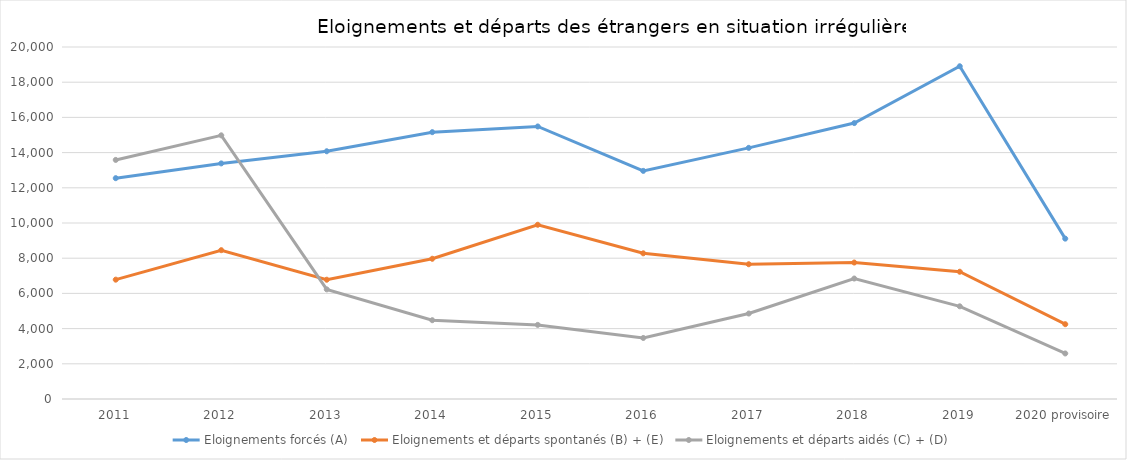
| Category | Eloignements forcés (A) | Eloignements et départs spontanés (B) + (E) | Eloignements et départs aidés (C) + (D) |
|---|---|---|---|
| 2011 | 12547 | 6781 | 13584 |
| 2012 | 13386 | 8455 | 14981 |
| 2013 | 14076 | 6777 | 6228 |
| 2014 | 15161 | 7968 | 4477 |
| 2015 | 15485 | 9900 | 4211 |
| 2016 | 12961 | 8278 | 3468 |
| 2017 | 14270 | 7657 | 4856 |
| 2018 | 15677 | 7754 | 6845 |
| 2019 | 18906 | 7231 | 5267 |
| 2020 provisoire | 9111 | 4250 | 2588 |